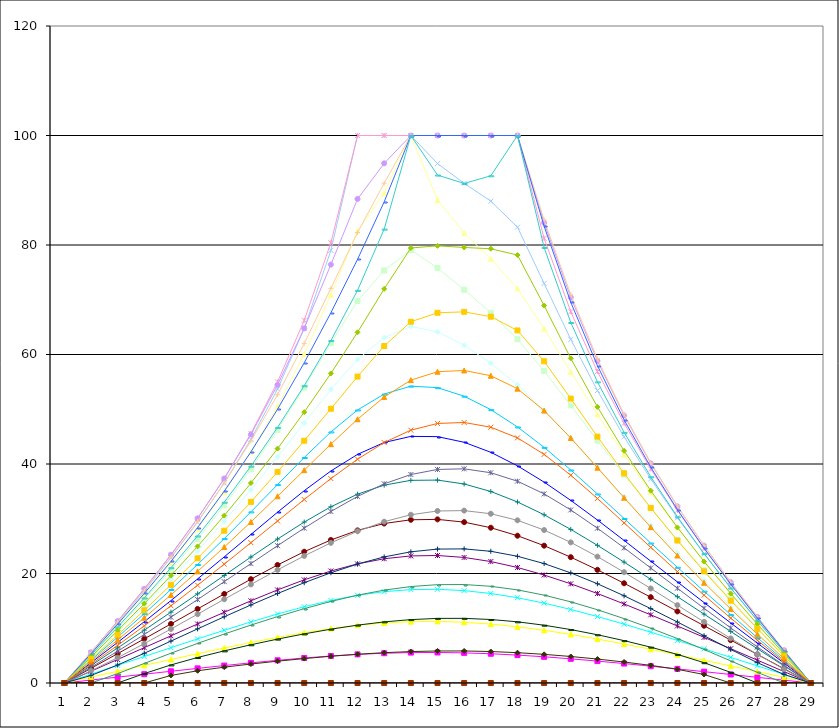
| Category | Series 0 | Series 1 | Series 2 | Series 3 | Series 4 | Series 5 | Series 6 | Series 7 | Series 8 | Series 9 | Series 10 | Series 11 | Series 12 | Series 13 | Series 14 | Series 15 | Series 16 | Series 17 | Series 18 | Series 19 | Series 20 | Series 21 | Series 22 | Series 23 | Series 24 | Series 25 | Series 26 | Series 27 | Series 28 |
|---|---|---|---|---|---|---|---|---|---|---|---|---|---|---|---|---|---|---|---|---|---|---|---|---|---|---|---|---|---|
| 0 | 0 | 0 | 0 | 0 | 0 | 0 | 0 | 0 | 0 | 0 | 0 | 0 | 0 | 0 | 0 | 0 | 0 | 0 | 0 | 0 | 0 | 0 | 0 | 0 | 0 | 0 | 0 | 0 | 0 |
| 1 | 0 | 0.537 | 1.074 | 1.61 | 2.145 | 2.675 | 3.194 | 3.694 | 4.165 | 4.593 | 4.963 | 5.26 | 5.471 | 5.586 | 5.601 | 5.517 | 5.341 | 5.082 | 4.751 | 4.357 | 3.91 | 3.413 | 2.859 | 2.215 | 1.375 | 0 | 0 | 0 | 0 |
| 2 | 0 | 1.074 | 2.148 | 3.223 | 4.296 | 5.36 | 6.407 | 7.418 | 8.373 | 9.244 | 10 | 10.607 | 11.038 | 11.272 | 11.3 | 11.127 | 10.766 | 10.237 | 9.563 | 8.768 | 7.871 | 6.884 | 5.809 | 4.626 | 3.286 | 1.715 | 0 | 0 | 0 |
| 3 | 0 | 1.609 | 3.221 | 4.837 | 6.454 | 8.064 | 9.654 | 11.199 | 12.665 | 14.011 | 15.184 | 16.13 | 16.802 | 17.163 | 17.202 | 16.925 | 16.359 | 15.537 | 14.498 | 13.281 | 11.92 | 10.443 | 8.865 | 7.194 | 5.428 | 3.576 | 1.719 | 0 | 0 |
| 4 | 0 | 2.143 | 4.291 | 6.45 | 8.619 | 10.789 | 12.945 | 15.057 | 17.079 | 18.95 | 20.595 | 21.929 | 22.875 | 23.378 | 23.418 | 23.013 | 22.206 | 21.053 | 19.611 | 17.938 | 16.086 | 14.101 | 12.016 | 9.859 | 7.654 | 5.441 | 3.301 | 1.384 | 0 |
| 5 | 0 | 2.67 | 5.351 | 8.053 | 10.781 | 13.529 | 16.282 | 19.005 | 21.643 | 24.116 | 26.315 | 28.116 | 29.392 | 30.054 | 30.078 | 29.503 | 28.401 | 26.857 | 24.954 | 22.773 | 20.387 | 17.858 | 15.239 | 12.57 | 9.888 | 7.233 | 4.659 | 2.234 | 0 |
| 6 | 0 | 3.185 | 6.39 | 9.632 | 12.922 | 16.265 | 19.647 | 23.037 | 26.373 | 29.555 | 32.435 | 34.826 | 36.523 | 37.369 | 37.339 | 36.519 | 35.038 | 33.02 | 30.576 | 27.813 | 24.829 | 21.707 | 18.512 | 15.296 | 12.095 | 8.944 | 5.869 | 2.892 | 0 |
| 7 | 0 | 3.68 | 7.391 | 11.161 | 15.012 | 18.96 | 23.005 | 27.124 | 31.258 | 35.295 | 39.045 | 42.231 | 44.503 | 45.562 | 45.388 | 44.197 | 42.213 | 39.607 | 36.516 | 33.075 | 29.41 | 25.627 | 21.807 | 18.005 | 14.254 | 10.577 | 6.982 | 3.465 | 0 |
| 8 | 0 | 4.146 | 8.334 | 12.608 | 17.005 | 21.558 | 26.288 | 31.195 | 36.24 | 41.32 | 46.22 | 50.548 | 53.697 | 54.987 | 54.455 | 52.666 | 50.011 | 46.68 | 42.808 | 38.56 | 34.107 | 29.585 | 25.085 | 20.661 | 16.34 | 12.128 | 8.017 | 3.986 | 0 |
| 9 | 0 | 4.568 | 9.192 | 13.932 | 18.842 | 23.979 | 29.394 | 35.126 | 41.187 | 47.527 | 53.966 | 60.046 | 64.749 | 66.233 | 64.778 | 62.002 | 58.483 | 54.295 | 49.474 | 44.251 | 38.875 | 33.52 | 28.286 | 23.216 | 18.317 | 13.578 | 8.972 | 4.46 | 0 |
| 10 | 0 | 4.933 | 9.936 | 15.084 | 20.452 | 26.123 | 32.184 | 38.73 | 45.855 | 53.635 | 62.07 | 70.919 | 79.022 | 80.419 | 76.422 | 72.083 | 67.622 | 62.545 | 56.542 | 50.095 | 43.62 | 37.335 | 31.323 | 25.598 | 20.135 | 14.896 | 9.831 | 4.885 | 0 |
| 11 | 0 | 5.226 | 10.536 | 16.016 | 21.76 | 27.875 | 34.488 | 41.754 | 49.868 | 59.088 | 69.761 | 82.538 | 100 | 100 | 88.407 | 82.285 | 77.379 | 71.719 | 64.054 | 55.967 | 48.175 | 40.876 | 34.075 | 27.717 | 21.73 | 16.04 | 10.57 | 5.248 | 0 |
| 12 | 0 | 5.437 | 10.965 | 16.683 | 22.696 | 29.13 | 36.14 | 43.928 | 52.776 | 63.086 | 75.349 | 89.472 | 100 | 100 | 94.92 | 91.273 | 87.888 | 82.899 | 71.988 | 61.544 | 52.238 | 43.919 | 36.383 | 29.465 | 23.029 | 16.962 | 11.163 | 5.538 | 0 |
| 13 | 0 | 5.555 | 11.206 | 17.054 | 23.212 | 29.81 | 37.013 | 45.042 | 54.222 | 65.133 | 79.076 | 100 | 100 | 100 | 100 | 100 | 100 | 100 | 79.455 | 65.983 | 55.314 | 46.178 | 38.074 | 30.729 | 23.959 | 17.616 | 11.58 | 5.742 | 0 |
| 14 | 0 | 5.577 | 11.249 | 17.116 | 23.286 | 29.885 | 37.062 | 45.002 | 53.939 | 64.148 | 75.821 | 88.223 | 94.873 | 100 | 100 | 100 | 100 | 92.772 | 79.849 | 67.619 | 56.856 | 47.406 | 39.005 | 31.421 | 24.46 | 17.965 | 11.8 | 5.848 | 0 |
| 15 | 0 | 5.504 | 11.098 | 16.874 | 22.931 | 29.381 | 36.347 | 43.967 | 52.383 | 61.698 | 71.836 | 82.2 | 91.268 | 100 | 100 | 100 | 100 | 91.24 | 79.548 | 67.79 | 57.087 | 47.583 | 39.12 | 31.488 | 24.496 | 17.982 | 11.808 | 5.851 | 0 |
| 16 | 0 | 5.342 | 10.764 | 16.35 | 22.185 | 28.362 | 34.978 | 42.135 | 49.928 | 58.424 | 67.628 | 77.47 | 88 | 100 | 100 | 100 | 100 | 92.638 | 79.314 | 66.905 | 56.118 | 46.719 | 38.403 | 30.915 | 24.055 | 17.661 | 11.597 | 5.747 | 0 |
| 17 | 0 | 5.099 | 10.267 | 15.576 | 21.096 | 26.902 | 33.068 | 39.668 | 46.77 | 54.442 | 62.78 | 72.055 | 83.26 | 100 | 100 | 100 | 100 | 100 | 78.163 | 64.398 | 53.761 | 44.774 | 36.858 | 29.715 | 23.148 | 17.008 | 11.175 | 5.539 | 0 |
| 18 | 0 | 4.786 | 9.631 | 14.59 | 19.722 | 25.083 | 30.725 | 36.698 | 43.042 | 49.794 | 56.995 | 64.709 | 72.984 | 81.215 | 84.06 | 84.608 | 83.426 | 79.554 | 68.942 | 58.761 | 49.755 | 41.756 | 34.541 | 27.939 | 21.812 | 16.05 | 10.554 | 5.233 | 0 |
| 19 | 0 | 4.416 | 8.878 | 13.432 | 18.119 | 22.981 | 28.051 | 33.356 | 38.906 | 44.698 | 50.695 | 56.802 | 62.754 | 67.817 | 70.417 | 70.944 | 69.543 | 65.848 | 59.291 | 51.949 | 44.744 | 37.952 | 31.612 | 25.686 | 20.112 | 14.825 | 9.758 | 4.841 | 0 |
| 20 | 0 | 4 | 8.035 | 12.139 | 16.342 | 20.671 | 25.144 | 29.767 | 34.529 | 39.395 | 44.286 | 49.052 | 53.411 | 56.881 | 58.846 | 59.21 | 57.954 | 55.002 | 50.425 | 44.999 | 39.318 | 33.697 | 28.27 | 23.08 | 18.125 | 13.381 | 8.812 | 4.371 | 0 |
| 21 | 0 | 3.548 | 7.122 | 10.746 | 14.439 | 18.217 | 22.086 | 26.038 | 30.049 | 34.067 | 38.002 | 41.707 | 44.957 | 47.451 | 48.877 | 49.095 | 48.06 | 45.783 | 42.407 | 38.304 | 33.834 | 29.247 | 24.691 | 20.24 | 15.928 | 11.762 | 7.738 | 3.832 | 0 |
| 22 | 0 | 3.071 | 6.16 | 9.283 | 12.451 | 15.672 | 18.944 | 22.251 | 25.562 | 28.823 | 31.949 | 34.816 | 37.261 | 39.088 | 40.115 | 40.235 | 39.408 | 37.663 | 35.116 | 31.976 | 28.466 | 24.767 | 21.006 | 17.262 | 13.583 | 10.003 | 6.544 | 3.218 | 0 |
| 23 | 0 | 2.576 | 5.165 | 7.774 | 10.411 | 13.078 | 15.766 | 18.459 | 21.125 | 23.713 | 26.153 | 28.348 | 30.181 | 31.524 | 32.262 | 32.32 | 31.673 | 30.345 | 28.418 | 26.018 | 23.286 | 20.35 | 17.304 | 14.217 | 11.141 | 8.122 | 5.218 | 2.497 | 0 |
| 24 | 0 | 2.07 | 4.147 | 6.237 | 8.342 | 10.46 | 12.583 | 14.694 | 16.764 | 18.752 | 20.602 | 22.243 | 23.592 | 24.565 | 25.088 | 25.111 | 24.619 | 23.628 | 22.192 | 20.39 | 18.313 | 16.041 | 13.642 | 11.163 | 8.641 | 6.126 | 3.708 | 1.551 | 0 |
| 25 | 0 | 1.557 | 3.117 | 4.685 | 6.26 | 7.838 | 9.413 | 10.97 | 12.486 | 13.93 | 15.26 | 16.428 | 17.378 | 18.056 | 18.413 | 18.419 | 18.062 | 17.356 | 16.332 | 15.039 | 13.532 | 11.861 | 10.06 | 8.15 | 6.136 | 4.034 | 1.935 | 0 | 0 |
| 26 | 0 | 1.039 | 2.081 | 3.125 | 4.173 | 5.22 | 6.262 | 7.286 | 8.28 | 9.22 | 10.081 | 10.832 | 11.438 | 11.867 | 12.089 | 12.088 | 11.856 | 11.4 | 10.74 | 9.902 | 8.917 | 7.809 | 6.588 | 5.242 | 3.718 | 1.938 | 0 | 0 | 0 |
| 27 | 0 | 0.52 | 1.041 | 1.563 | 2.086 | 2.608 | 3.126 | 3.635 | 4.126 | 4.59 | 5.013 | 5.38 | 5.675 | 5.883 | 5.99 | 5.988 | 5.873 | 5.65 | 5.326 | 4.913 | 4.425 | 3.869 | 3.242 | 2.51 | 1.557 | 0 | 0 | 0 | 0 |
| 28 | 0 | 0 | 0 | 0 | 0 | 0 | 0 | 0 | 0 | 0 | 0 | 0 | 0 | 0 | 0 | 0 | 0 | 0 | 0 | 0 | 0 | 0 | 0 | 0 | 0 | 0 | 0 | 0 | 0 |